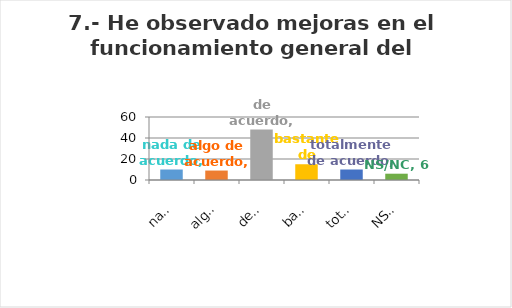
| Category | Series 0 |
|---|---|
| nada de acuerdo | 10 |
| algo de acuerdo | 9 |
| de acuerdo | 48 |
| bastante de acuerdo | 15 |
| totalmente de acuerdo | 10 |
| NS/NC | 6 |